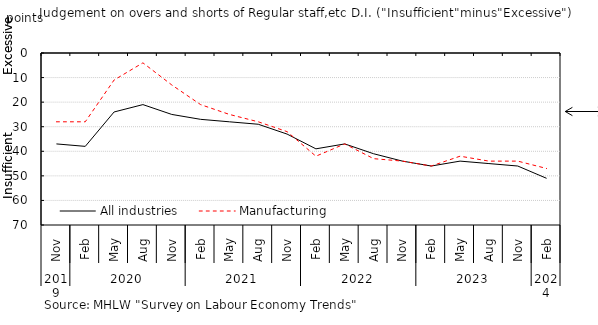
| Category | All industries | Manufacturing |
|---|---|---|
| 0 | 37 | 28 |
| 1 | 38 | 28 |
| 2 | 24 | 11 |
| 3 | 21 | 4 |
| 4 | 25 | 13 |
| 5 | 27 | 21 |
| 6 | 28 | 25 |
| 7 | 29 | 28 |
| 8 | 33 | 32 |
| 9 | 39 | 42 |
| 10 | 37 | 37 |
| 11 | 41 | 43 |
| 12 | 44 | 44 |
| 13 | 46 | 46 |
| 14 | 44 | 42 |
| 15 | 45 | 44 |
| 16 | 46 | 44 |
| 17 | 51 | 47 |